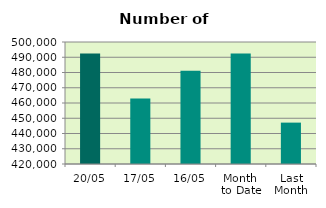
| Category | Series 0 |
|---|---|
| 20/05 | 492398 |
| 17/05 | 462894 |
| 16/05 | 481114 |
| Month 
to Date | 492503.385 |
| Last
Month | 447135.9 |